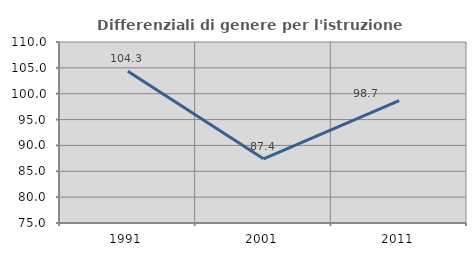
| Category | Differenziali di genere per l'istruzione superiore |
|---|---|
| 1991.0 | 104.332 |
| 2001.0 | 87.42 |
| 2011.0 | 98.682 |